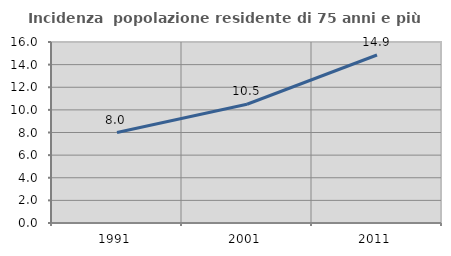
| Category | Incidenza  popolazione residente di 75 anni e più |
|---|---|
| 1991.0 | 8 |
| 2001.0 | 10.498 |
| 2011.0 | 14.851 |